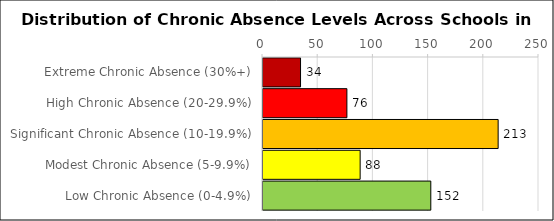
| Category | Number of Schools |
|---|---|
| Extreme Chronic Absence (30%+) | 34 |
| High Chronic Absence (20-29.9%) | 76 |
| Significant Chronic Absence (10-19.9%) | 213 |
| Modest Chronic Absence (5-9.9%) | 88 |
| Low Chronic Absence (0-4.9%) | 152 |